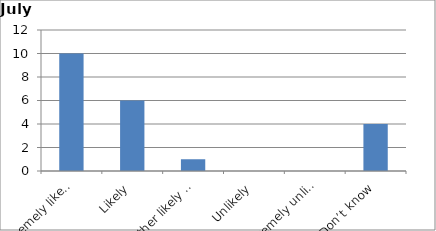
| Category | Series 0 |
|---|---|
| Extremely likely | 10 |
| Likely | 6 |
| Neither likely nor unlikely | 1 |
| Unlikely | 0 |
| Extremely unlikely | 0 |
| Don’t know | 4 |